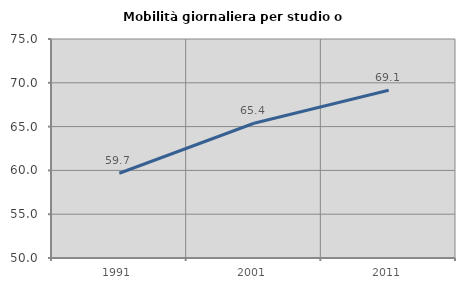
| Category | Mobilità giornaliera per studio o lavoro |
|---|---|
| 1991.0 | 59.677 |
| 2001.0 | 65.381 |
| 2011.0 | 69.142 |